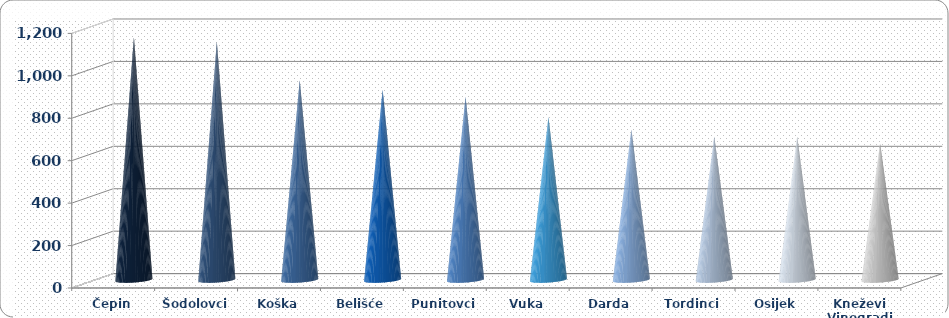
| Category | Produktivnost |
|---|---|
| Čepin | 1143.979 |
| Šodolovci | 1123.489 |
| Koška | 941.806 |
| Belišće | 896.294 |
| Punitovci | 863.288 |
| Vuka | 768.263 |
| Darda | 709.753 |
| Tordinci | 676.346 |
| Osijek | 675.811 |
| Kneževi Vinogradi | 644.031 |